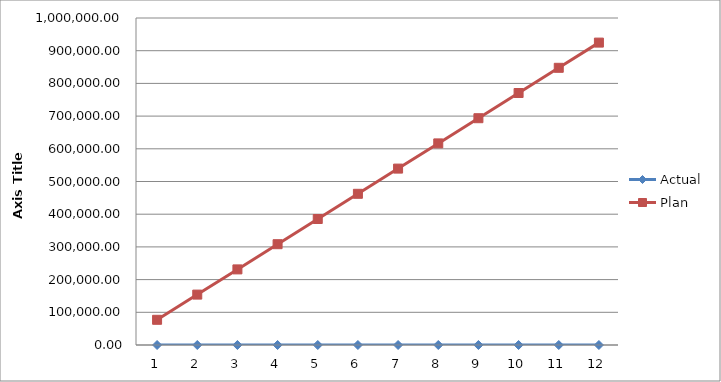
| Category | Actual | Plan |
|---|---|---|
| 0 | 0 | 77062.5 |
| 1 | 0 | 154125 |
| 2 | 0 | 231187.5 |
| 3 | 0 | 308250 |
| 4 | 0 | 385312.5 |
| 5 | 0 | 462375 |
| 6 | 0 | 539437.5 |
| 7 | 0 | 616500 |
| 8 | 0 | 693562.5 |
| 9 | 0 | 770625 |
| 10 | 0 | 847687.5 |
| 11 | 0 | 924750 |